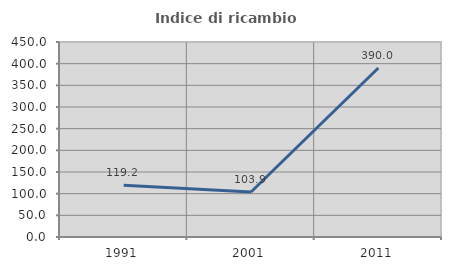
| Category | Indice di ricambio occupazionale  |
|---|---|
| 1991.0 | 119.231 |
| 2001.0 | 103.922 |
| 2011.0 | 390 |